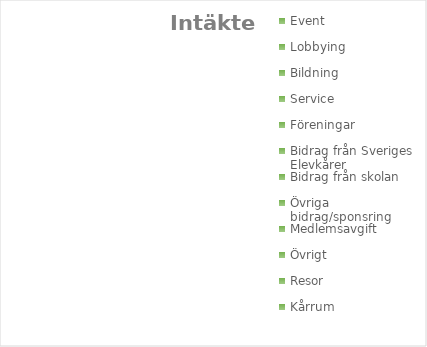
| Category | Series 0 |
|---|---|
| Event | 0 |
| Lobbying | 0 |
| Bildning | 0 |
| Service | 0 |
| Föreningar | 0 |
| Bidrag från Sveriges Elevkårer | 0 |
| Bidrag från skolan | 0 |
| Övriga bidrag/sponsring | 0 |
| Medlemsavgift | 0 |
| Övrigt | 0 |
| Resor | 0 |
| Kårrum | 0 |